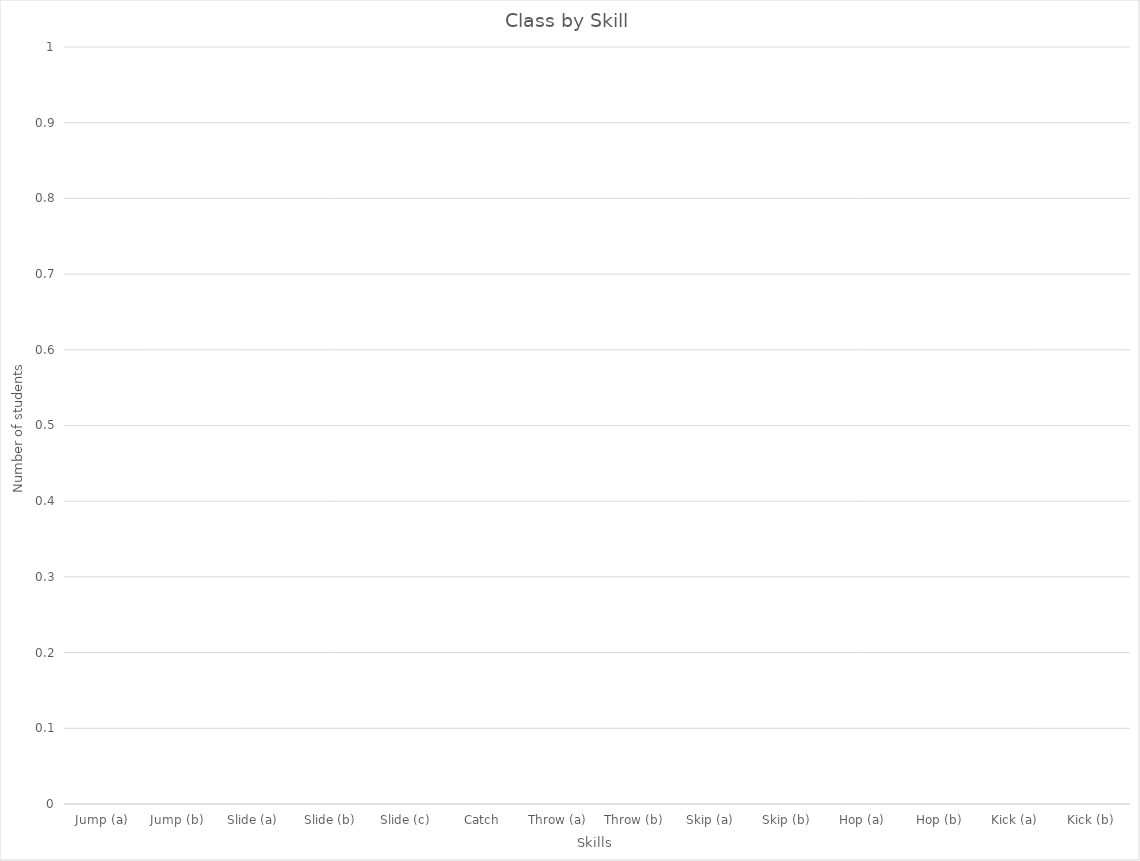
| Category | Series 0 |
|---|---|
| Jump (a) | 0 |
| Jump (b) | 0 |
| Slide (a) | 0 |
| Slide (b) | 0 |
| Slide (c) | 0 |
| Catch | 0 |
| Throw (a) | 0 |
| Throw (b) | 0 |
| Skip (a) | 0 |
| Skip (b) | 0 |
| Hop (a) | 0 |
| Hop (b) | 0 |
| Kick (a) | 0 |
| Kick (b) | 0 |